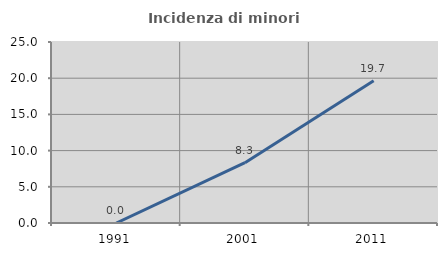
| Category | Incidenza di minori stranieri |
|---|---|
| 1991.0 | 0 |
| 2001.0 | 8.333 |
| 2011.0 | 19.653 |